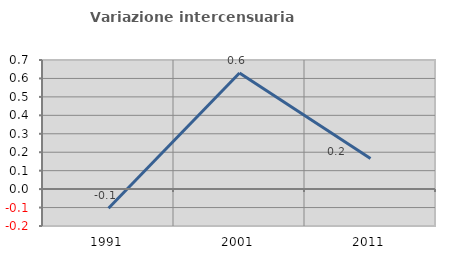
| Category | Variazione intercensuaria annua |
|---|---|
| 1991.0 | -0.104 |
| 2001.0 | 0.629 |
| 2011.0 | 0.166 |